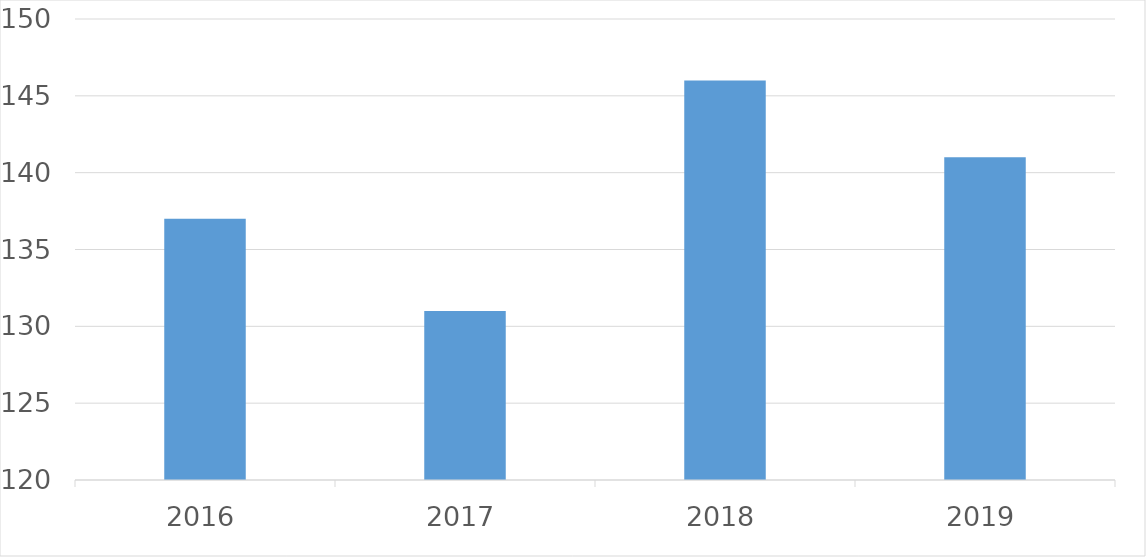
| Category | Series 0 |
|---|---|
| 2016 | 137 |
| 2017 | 131 |
| 2018 | 146 |
| 2019 | 141 |